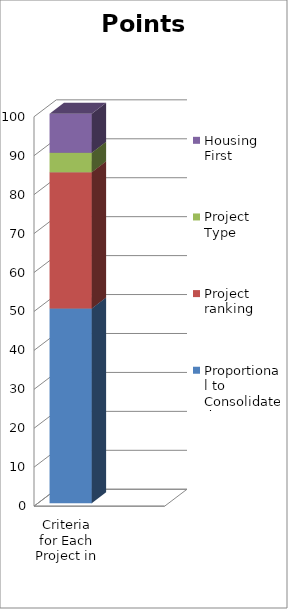
| Category | Proportional to Consolidated Application | Project ranking | Project Type | Housing First |
|---|---|---|---|---|
| Criteria for Each Project in Tier 2 | 50 | 35 | 5 | 10 |